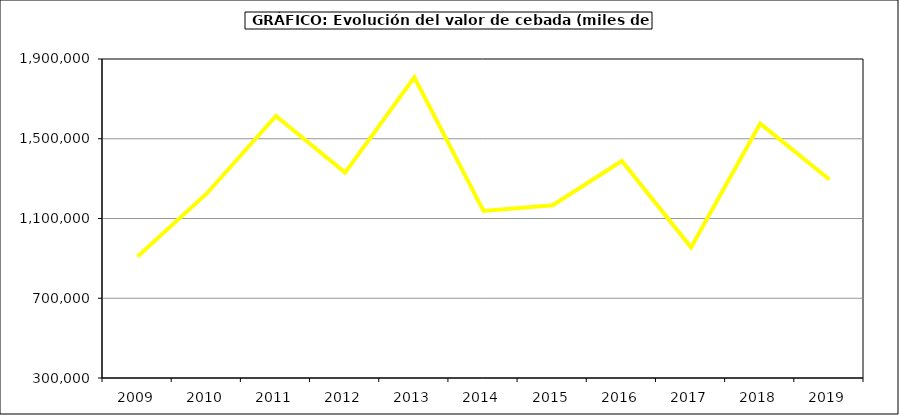
| Category | Valor |
|---|---|
| 2009.0 | 909802.97 |
| 2010.0 | 1225605.118 |
| 2011.0 | 1614321.82 |
| 2012.0 | 1330052.285 |
| 2013.0 | 1807903.139 |
| 2014.0 | 1138276.107 |
| 2015.0 | 1166688 |
| 2016.0 | 1388353 |
| 2017.0 | 955259.354 |
| 2018.0 | 1575757.741 |
| 2019.0 | 1295734.047 |